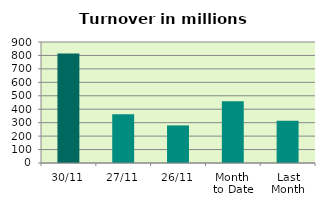
| Category | Series 0 |
|---|---|
| 30/11 | 814.496 |
| 27/11 | 363.472 |
| 26/11 | 279.599 |
| Month 
to Date | 459.961 |
| Last
Month | 314.143 |